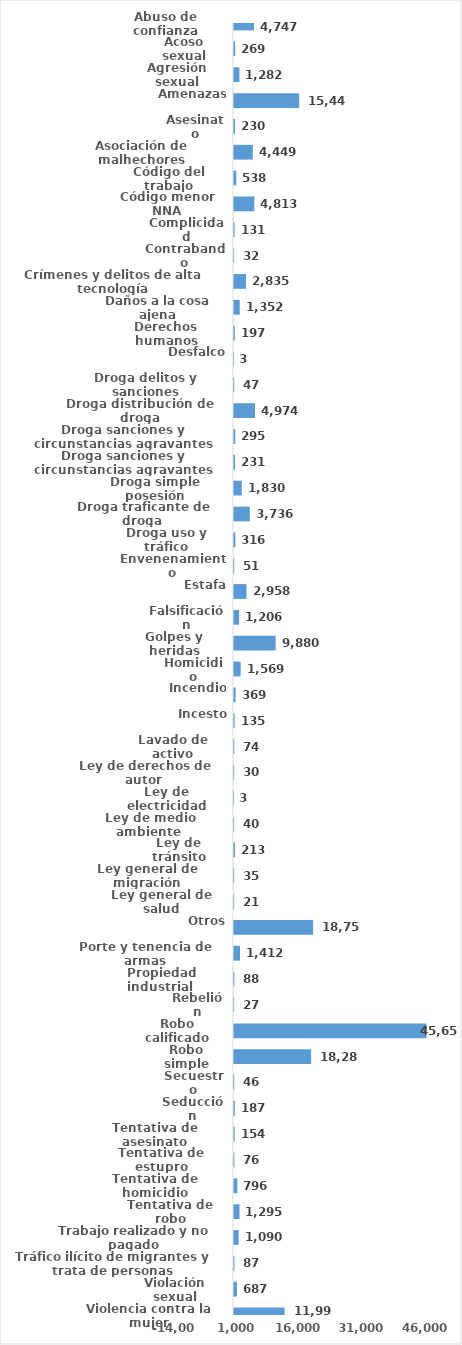
| Category | Series 0 |
|---|---|
| Abuso de confianza | 4747 |
| Acoso sexual | 269 |
| Agresión sexual | 1282 |
| Amenazas | 15446 |
| Asesinato | 230 |
| Asociación de malhechores | 4449 |
| Código del trabajo | 538 |
| Código menor NNA | 4813 |
| Complicidad | 131 |
| Contrabando | 32 |
| Crímenes y delitos de alta tecnología | 2835 |
| Daños a la cosa ajena | 1352 |
| Derechos humanos | 197 |
| Desfalco | 3 |
| Droga delitos y sanciones | 47 |
| Droga distribución de droga | 4974 |
| Droga sanciones y circunstancias agravantes | 295 |
| Droga sanciones y circunstancias agravantes | 231 |
| Droga simple posesión | 1830 |
| Droga traficante de droga  | 3736 |
| Droga uso y tráfico | 316 |
| Envenenamiento | 51 |
| Estafa | 2958 |
| Falsificación | 1206 |
| Golpes y heridas | 9880 |
| Homicidio | 1569 |
| Incendio | 369 |
| Incesto | 135 |
| Lavado de activo | 74 |
| Ley de derechos de autor  | 30 |
| Ley de electricidad | 3 |
| Ley de medio ambiente  | 40 |
| Ley de tránsito | 213 |
| Ley general de migración | 35 |
| Ley general de salud | 21 |
| Otros | 18759 |
| Porte y tenencia de armas | 1412 |
| Propiedad industrial  | 88 |
| Rebelión | 27 |
| Robo calificado | 45650 |
| Robo simple | 18282 |
| Secuestro | 46 |
| Seducción | 187 |
| Tentativa de asesinato | 154 |
| Tentativa de estupro | 76 |
| Tentativa de homicidio | 796 |
| Tentativa de robo | 1295 |
| Trabajo realizado y no pagado | 1090 |
| Tráfico ilícito de migrantes y trata de personas | 87 |
| Violación sexual | 687 |
| Violencia contra la mujer | 11996 |